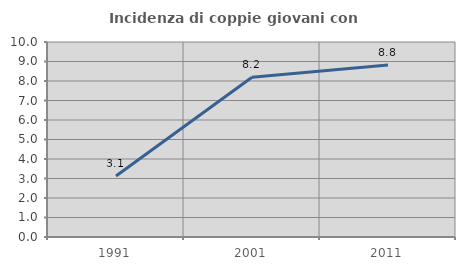
| Category | Incidenza di coppie giovani con figli |
|---|---|
| 1991.0 | 3.125 |
| 2001.0 | 8.197 |
| 2011.0 | 8.824 |